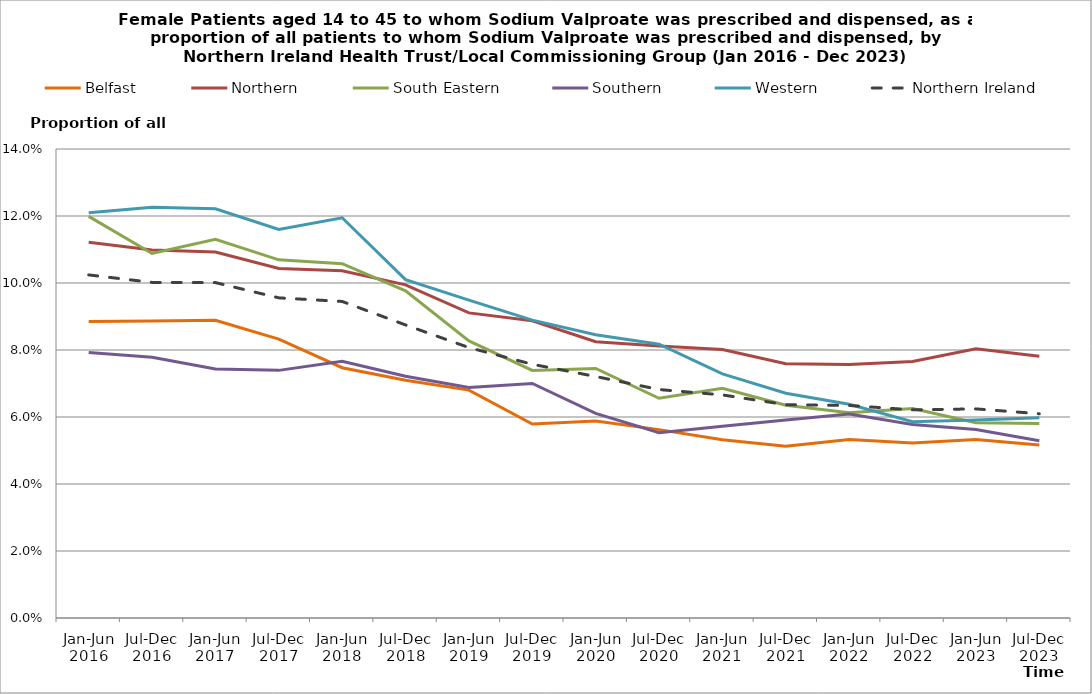
| Category | Belfast | Northern | South Eastern | Southern | Western | Northern Ireland |
|---|---|---|---|---|---|---|
| Jan-Jun 2016 | 0.089 | 0.112 | 0.12 | 0.079 | 0.121 | 0.102 |
| Jul-Dec 2016 | 0.089 | 0.11 | 0.109 | 0.078 | 0.123 | 0.1 |
| Jan-Jun 2017 | 0.089 | 0.109 | 0.113 | 0.074 | 0.122 | 0.1 |
| Jul-Dec 2017 | 0.083 | 0.104 | 0.107 | 0.074 | 0.116 | 0.096 |
| Jan-Jun 2018 | 0.075 | 0.104 | 0.106 | 0.077 | 0.119 | 0.094 |
| Jul-Dec 2018 | 0.071 | 0.099 | 0.098 | 0.072 | 0.101 | 0.087 |
| Jan-Jun 2019 | 0.068 | 0.091 | 0.083 | 0.069 | 0.095 | 0.081 |
| Jul-Dec 2019 | 0.058 | 0.089 | 0.074 | 0.07 | 0.089 | 0.076 |
| Jan-Jun 2020 | 0.059 | 0.082 | 0.075 | 0.061 | 0.085 | 0.072 |
| Jul-Dec 2020 | 0.056 | 0.081 | 0.066 | 0.055 | 0.082 | 0.068 |
| Jan-Jun 2021 | 0.053 | 0.08 | 0.069 | 0.057 | 0.073 | 0.067 |
| Jul-Dec 2021 | 0.051 | 0.076 | 0.064 | 0.059 | 0.067 | 0.064 |
| Jan-Jun 2022 | 0.053 | 0.076 | 0.061 | 0.061 | 0.064 | 0.063 |
| Jul-Dec 2022 | 0.052 | 0.077 | 0.063 | 0.058 | 0.059 | 0.062 |
| Jan-Jun 2023 | 0.053 | 0.08 | 0.058 | 0.056 | 0.059 | 0.062 |
| Jul-Dec 2023 | 0.052 | 0.078 | 0.058 | 0.053 | 0.06 | 0.061 |